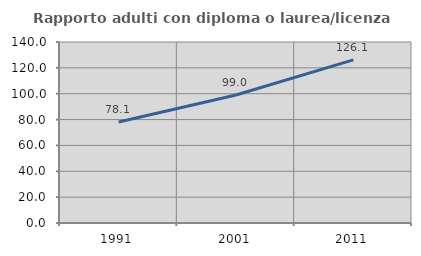
| Category | Rapporto adulti con diploma o laurea/licenza media  |
|---|---|
| 1991.0 | 78.092 |
| 2001.0 | 99.021 |
| 2011.0 | 126.147 |